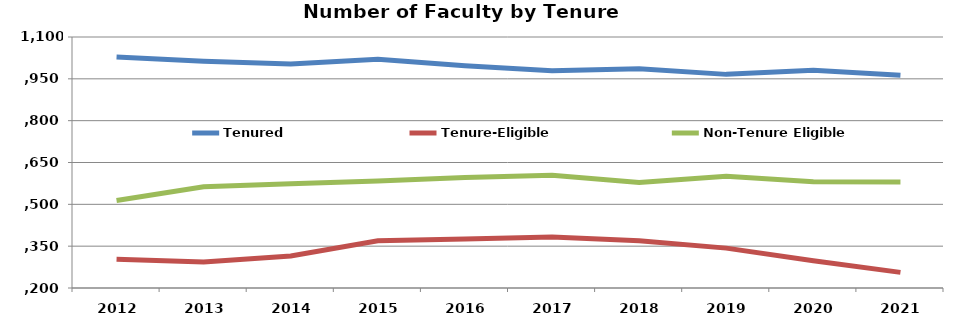
| Category | Tenured | Tenure-Eligible | Non-Tenure Eligible |
|---|---|---|---|
| 2012.0 | 1028 | 303 | 514 |
| 2013.0 | 1013 | 293 | 563 |
| 2014.0 | 1003 | 315 | 574 |
| 2015.0 | 1020 | 369 | 584 |
| 2016.0 | 997 | 376 | 596 |
| 2017.0 | 979 | 383 | 604 |
| 2018.0 | 986 | 369 | 578 |
| 2019.0 | 966 | 343 | 601 |
| 2020.0 | 981 | 298 | 581 |
| 2021.0 | 963 | 256 | 580 |